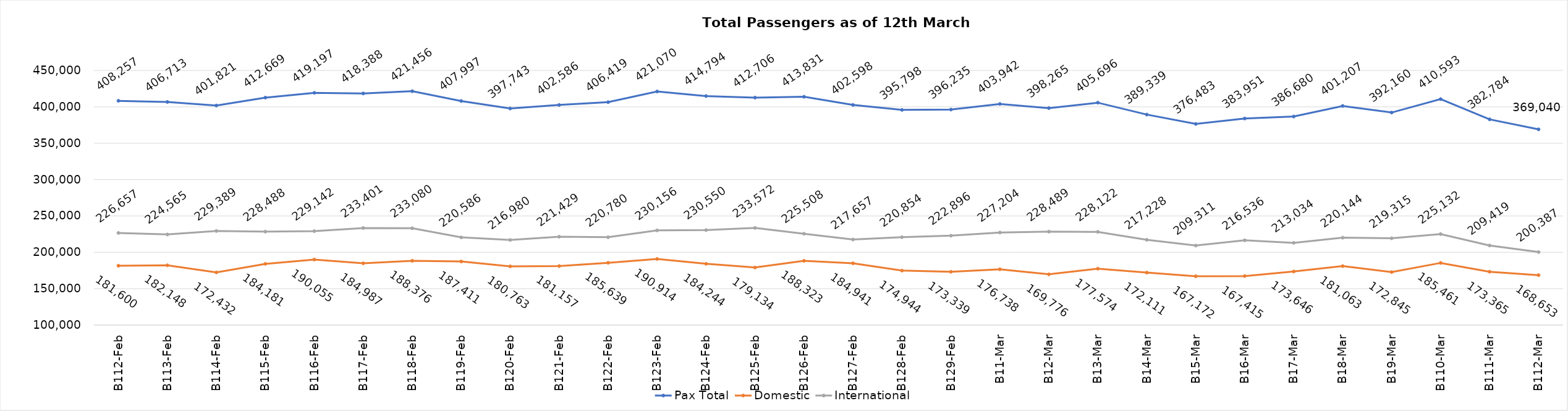
| Category | Pax Total | Domestic | International |
|---|---|---|---|
| 2024-02-12 | 408257 | 181600 | 226657 |
| 2024-02-13 | 406713 | 182148 | 224565 |
| 2024-02-14 | 401821 | 172432 | 229389 |
| 2024-02-15 | 412669 | 184181 | 228488 |
| 2024-02-16 | 419197 | 190055 | 229142 |
| 2024-02-17 | 418388 | 184987 | 233401 |
| 2024-02-18 | 421456 | 188376 | 233080 |
| 2024-02-19 | 407997 | 187411 | 220586 |
| 2024-02-20 | 397743 | 180763 | 216980 |
| 2024-02-21 | 402586 | 181157 | 221429 |
| 2024-02-22 | 406419 | 185639 | 220780 |
| 2024-02-23 | 421070 | 190914 | 230156 |
| 2024-02-24 | 414794 | 184244 | 230550 |
| 2024-02-25 | 412706 | 179134 | 233572 |
| 2024-02-26 | 413831 | 188323 | 225508 |
| 2024-02-27 | 402598 | 184941 | 217657 |
| 2024-02-28 | 395798 | 174944 | 220854 |
| 2024-02-29 | 396235 | 173339 | 222896 |
| 2024-03-01 | 403942 | 176738 | 227204 |
| 2024-03-02 | 398265 | 169776 | 228489 |
| 2024-03-03 | 405696 | 177574 | 228122 |
| 2024-03-04 | 389339 | 172111 | 217228 |
| 2024-03-05 | 376483 | 167172 | 209311 |
| 2024-03-06 | 383951 | 167415 | 216536 |
| 2024-03-07 | 386680 | 173646 | 213034 |
| 2024-03-08 | 401207 | 181063 | 220144 |
| 2024-03-09 | 392160 | 172845 | 219315 |
| 2024-03-10 | 410593 | 185461 | 225132 |
| 2024-03-11 | 382784 | 173365 | 209419 |
| 2024-03-12 | 369040 | 168653 | 200387 |